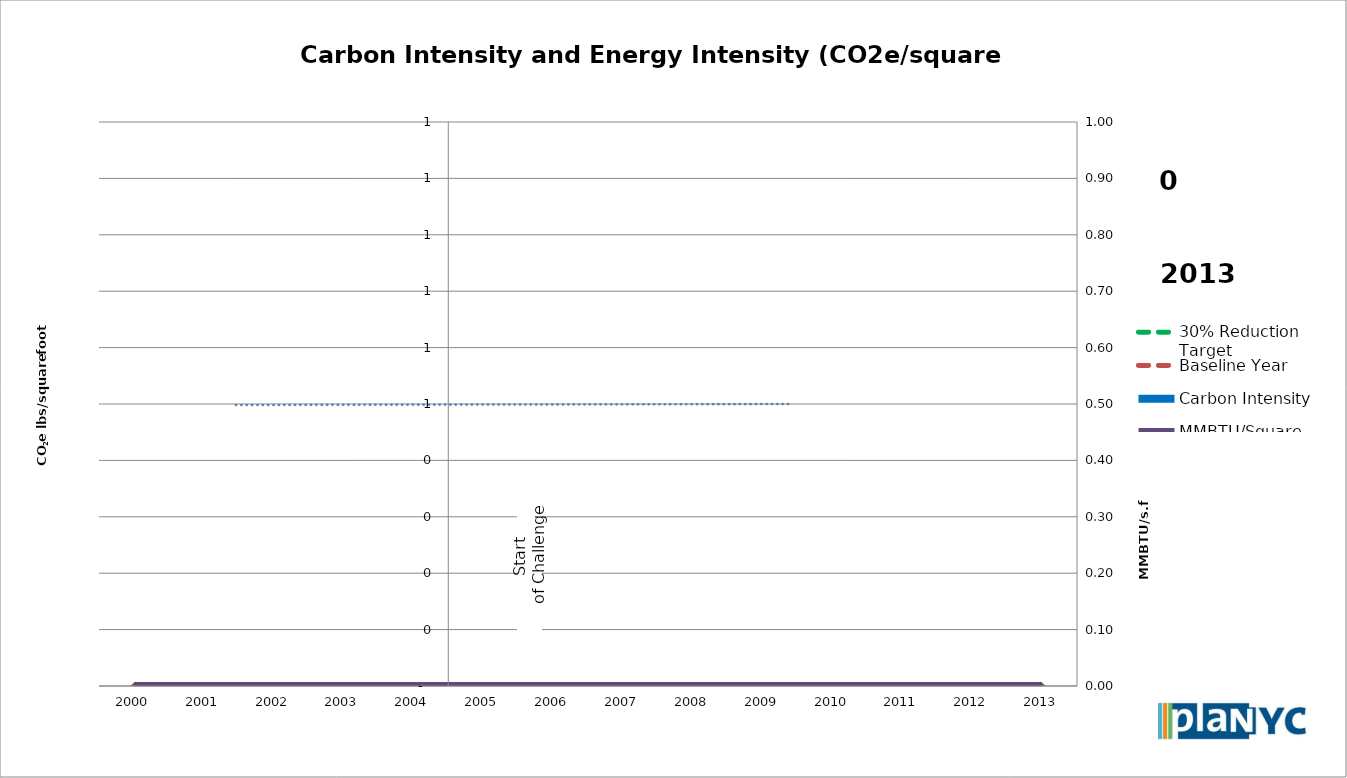
| Category | 30% Reduction Target | Baseline Year | Carbon Intensity |
|---|---|---|---|
| 2000.0 | 0 | 0 | 0 |
| 2001.0 | 0 | 0 | 0 |
| 2002.0 | 0 | 0 | 0 |
| 2003.0 | 0 | 0 | 0 |
| 2004.0 | 0 | 0 | 0 |
| 2005.0 | 0 | 0 | 0 |
| 2006.0 | 0 | 0 | 0 |
| 2007.0 | 0 | 0 | 0 |
| 2008.0 | 0 | 0 | 0 |
| 2009.0 | 0 | 0 | 0 |
| 2010.0 | 0 | 0 | 0 |
| 2011.0 | 0 | 0 | 0 |
| 2012.0 | 0 | 0 | 0 |
| 2013.0 | 0 | 0 | 0 |